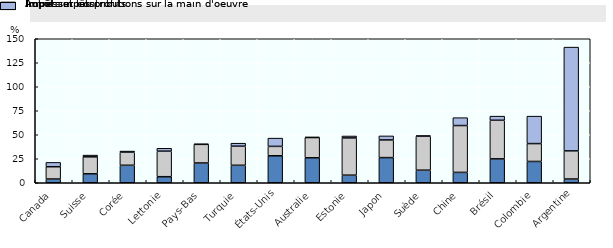
| Category | Impôt sur les profits | Impôts et contributions sur la main d'oeuvre | Autres impôts |
|---|---|---|---|
| Canada | 3.9 | 12.8 | 4.5 |
| Suisse | 9.3 | 17.7 | 1.8 |
| Corée | 18.2 | 13.6 | 1.2 |
| Lettonie | 6.3 | 26.6 | 3 |
| Pays-Bas | 20.6 | 19.4 | 0.4 |
| Turquie | 18.2 | 19.9 | 3.1 |
| États-Unis | 28.1 | 9.8 | 8.6 |
| Australie | 26 | 21.1 | 0.5 |
| Estonie | 7.9 | 38.8 | 2 |
| Japon | 26.2 | 18.4 | 4.2 |
| Suède | 13.1 | 35.4 | 0.6 |
| Chine | 10.8 | 48.8 | 8.2 |
| Brésil | 24.9 | 40.2 | 4.3 |
| Colombie | 22.2 | 18.6 | 28.6 |
| Argentine | 3.9 | 29.3 | 108.1 |